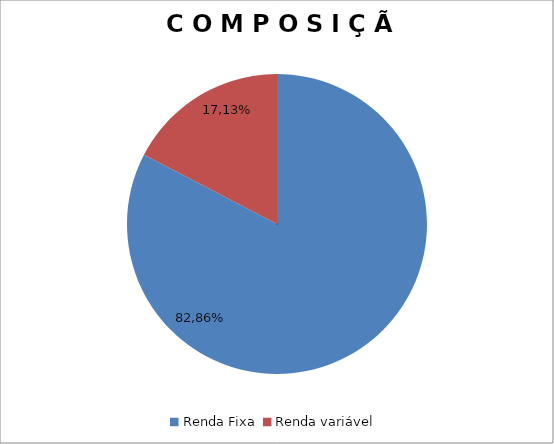
| Category | Series 0 |
|---|---|
| Renda Fixa  | 0.826 |
| Renda variável  | 0.174 |